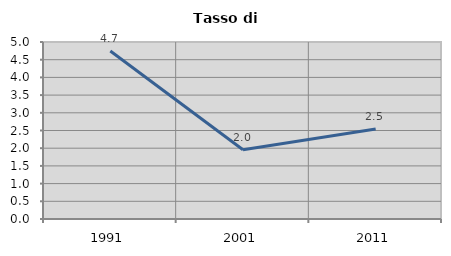
| Category | Tasso di disoccupazione   |
|---|---|
| 1991.0 | 4.745 |
| 2001.0 | 1.958 |
| 2011.0 | 2.543 |